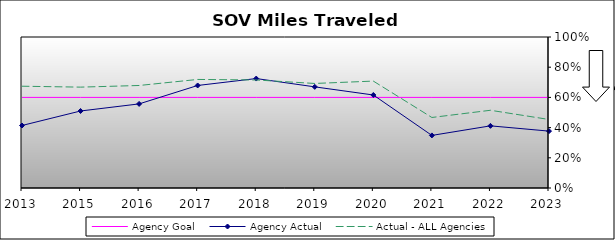
| Category | Agency Goal | Agency Actual | Actual - ALL Agencies |
|---|---|---|---|
| 2013.0 | 0.6 | 0.414 | 0.674 |
| 2015.0 | 0.6 | 0.51 | 0.668 |
| 2016.0 | 0.6 | 0.557 | 0.679 |
| 2017.0 | 0.6 | 0.679 | 0.719 |
| 2018.0 | 0.6 | 0.725 | 0.715 |
| 2019.0 | 0.6 | 0.67 | 0.692 |
| 2020.0 | 0.6 | 0.616 | 0.708 |
| 2021.0 | 0.6 | 0.348 | 0.467 |
| 2022.0 | 0.6 | 0.412 | 0.515 |
| 2023.0 | 0.6 | 0.377 | 0.454 |